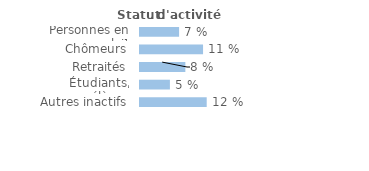
| Category | Series 0 |
|---|---|
| Personnes en emploi¹ | 0.07 |
| Chômeurs | 0.113 |
| Retraités | 0.081 |
| Étudiants, élèves | 0.053 |
| Autres inactifs  | 0.119 |